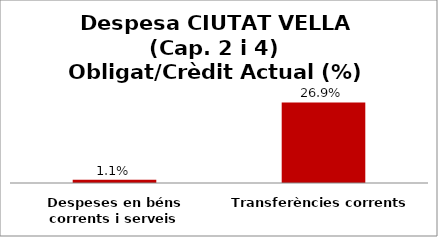
| Category | Series 0 |
|---|---|
| Despeses en béns corrents i serveis | 0.011 |
| Transferències corrents | 0.269 |